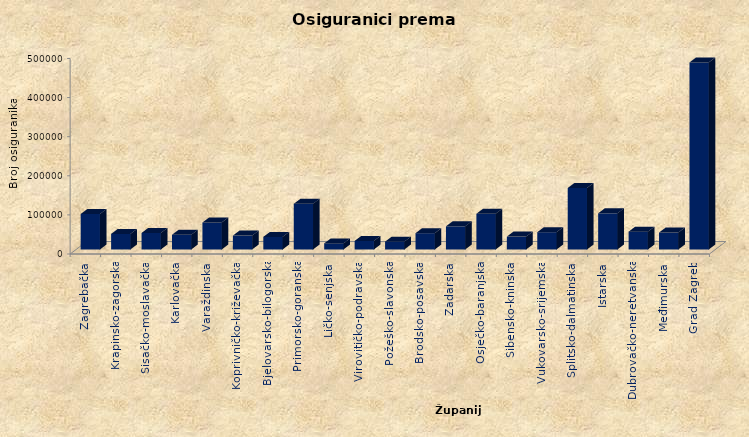
| Category | Series 0 |
|---|---|
| Zagrebačka | 90700 |
| Krapinsko-zagorska | 39801 |
| Sisačko-moslavačka | 42277 |
| Karlovačka | 37604 |
| Varaždinska | 68982 |
| Koprivničko-križevačka | 35575 |
| Bjelovarsko-bilogorska | 32165 |
| Primorsko-goranska | 116730 |
| Ličko-senjska | 15601 |
| Virovitičko-podravska | 21913 |
| Požeško-slavonska | 20039 |
| Brodsko-posavska | 41716 |
| Zadarska | 59210 |
| Osječko-baranjska | 91376 |
| Šibensko-kninska | 32945 |
| Vukovarsko-srijemska | 44219 |
| Splitsko-dalmatinska | 157226 |
| Istarska | 92482 |
| Dubrovačko-neretvanska | 45568 |
| Međimurska | 43296 |
| Grad Zagreb | 478309 |